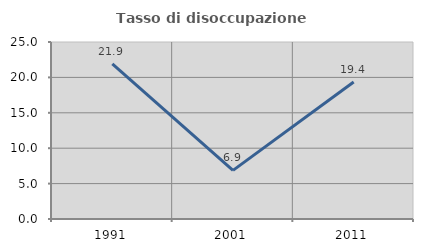
| Category | Tasso di disoccupazione giovanile  |
|---|---|
| 1991.0 | 21.901 |
| 2001.0 | 6.87 |
| 2011.0 | 19.355 |